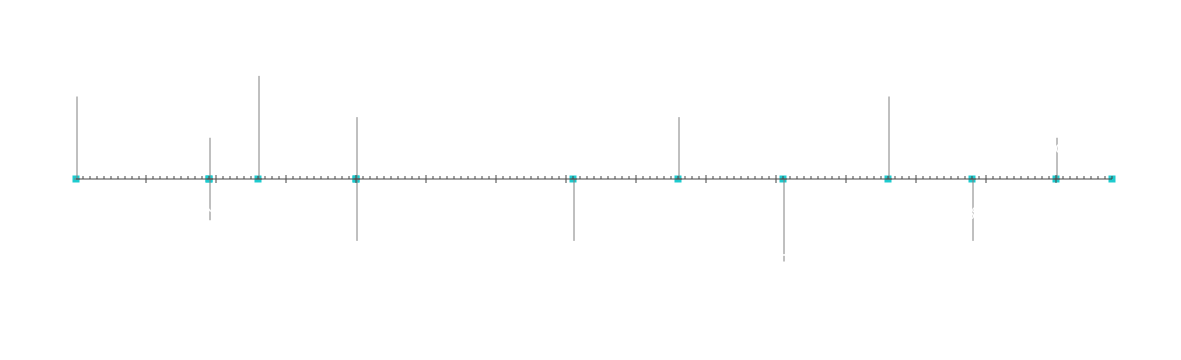
| Category | Konum |
|---|---|
| Proje Başlangıcı | 20 |
| Kilometre Taşı 1 | 10 |
| Kilometre Taşı 2 | -10 |
| Kilometre Taşı 3 | 25 |
| Kilometre Taşı 4 | -15 |
| Kilometre Taşı 5 | 15 |
| Kilometre Taşı 6 | -15 |
| Kilometre Taşı 7 | 15 |
| Kilometre Taşı 8 | -20 |
| Kilometre Taşı 9 | 20 |
| Kilometre Taşı 10 | -15 |
| Kilometre Taşı 11 | 10 |
| Proje Sonu | 5 |